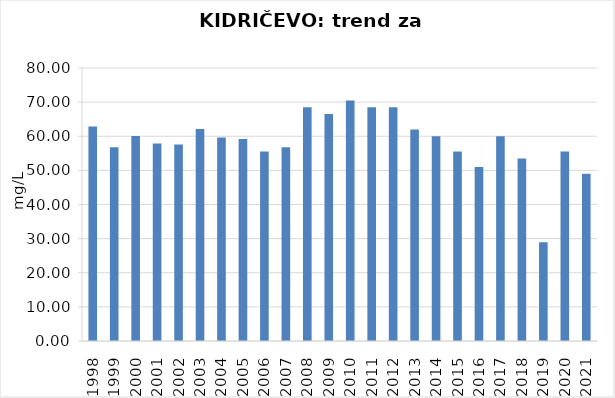
| Category | Vsota |
|---|---|
| 1998 | 62.85 |
| 1999 | 56.8 |
| 2000 | 60.1 |
| 2001 | 57.9 |
| 2002 | 57.6 |
| 2003 | 62.1 |
| 2004 | 59.633 |
| 2005 | 59.2 |
| 2006 | 55.5 |
| 2007 | 56.75 |
| 2008 | 68.5 |
| 2009 | 66.5 |
| 2010 | 70.5 |
| 2011 | 68.5 |
| 2012 | 68.5 |
| 2013 | 62 |
| 2014 | 60 |
| 2015 | 55.5 |
| 2016 | 51 |
| 2017 | 60 |
| 2018 | 53.5 |
| 2019 | 28.95 |
| 2020 | 55.5 |
| 2021 | 49 |